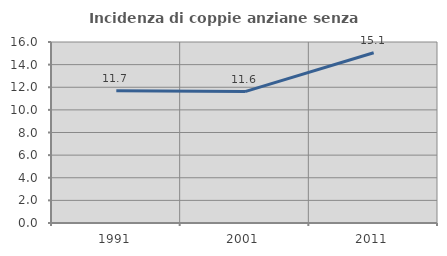
| Category | Incidenza di coppie anziane senza figli  |
|---|---|
| 1991.0 | 11.699 |
| 2001.0 | 11.615 |
| 2011.0 | 15.054 |